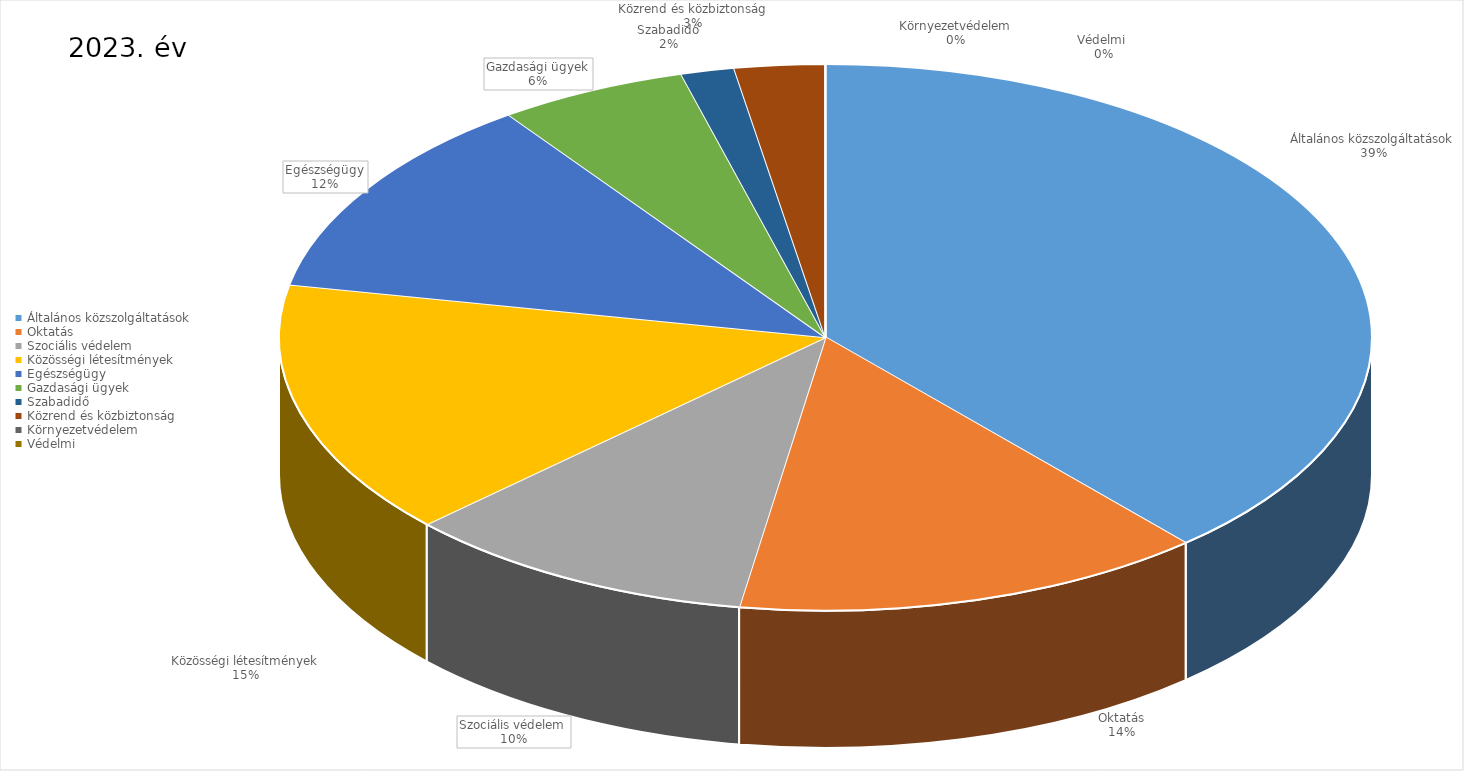
| Category | 2023. év |
|---|---|
| Általános közszolgáltatások | 18994376263 |
| Oktatás | 6885533418 |
| Szociális védelem | 5166919629 |
| Közösségi létesítmények | 7432316463 |
| Egészségügy | 5940157506 |
| Gazdasági ügyek | 2753975645 |
| Szabadidő | 778632766 |
| Közrend és közbiztonság | 1317145177 |
| Környezetvédelem | 0 |
| Védelmi  | 2616200 |